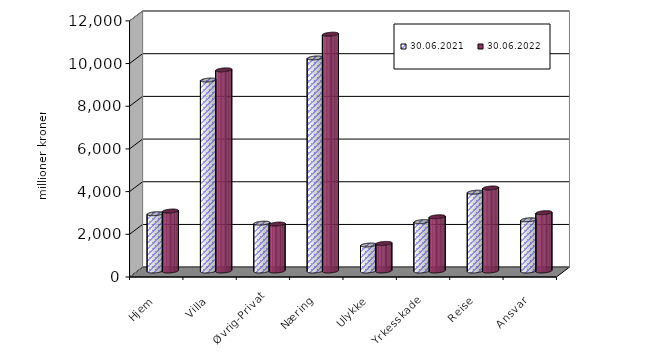
| Category | 30.06.2021 | 30.06.2022 |
|---|---|---|
| Hjem | 2684.583 | 2809.199 |
| Villa | 8946.038 | 9423.435 |
| Øvrig-Privat | 2242.358 | 2198.713 |
| Næring | 9981.849 | 11094.916 |
| Ulykke | 1217.376 | 1294.003 |
| Yrkesskade | 2312.827 | 2541.432 |
| Reise | 3692.189 | 3888.861 |
| Ansvar | 2400.015 | 2733.321 |